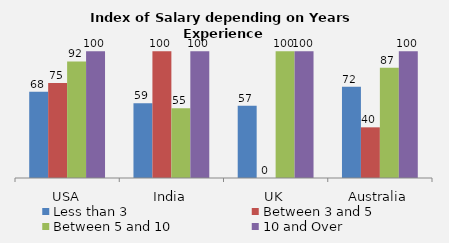
| Category | Less than 3 | Between 3 and 5 | Between 5 and 10 | 10 and Over |
|---|---|---|---|---|
| USA | 68 | 75 | 92 | 100 |
| India | 59 | 100 | 55 | 100 |
| UK | 57 | 0 | 100 | 100 |
| Australia | 72 | 40 | 87 | 100 |